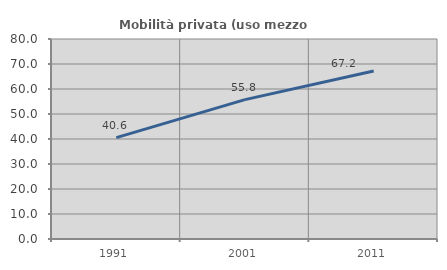
| Category | Mobilità privata (uso mezzo privato) |
|---|---|
| 1991.0 | 40.567 |
| 2001.0 | 55.761 |
| 2011.0 | 67.216 |